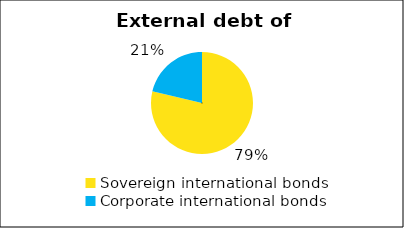
| Category | International bond market volume |
|---|---|
| Sovereign international bonds | 3.25 |
| Corporate international bonds | 0.881 |